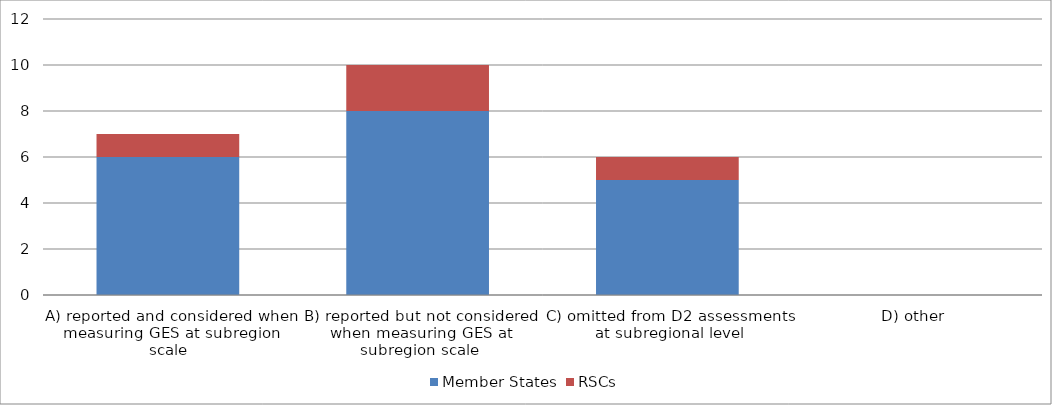
| Category | Member States | RSCs |
|---|---|---|
| A) reported and considered when measuring GES at subregion scale | 6 | 1 |
| B) reported but not considered when measuring GES at subregion scale | 8 | 2 |
| C) omitted from D2 assessments at subregional level | 5 | 1 |
| D) other  | 0 | 0 |